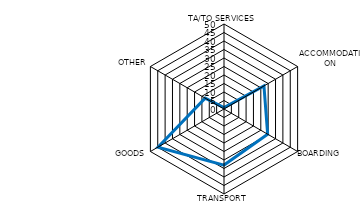
| Category | Series 0 |
|---|---|
| TA/TO SERVICES | 0.807 |
| ACCOMMODATION | 27.139 |
| BOARDING | 29.643 |
| TRANSPORT | 32.999 |
| GOODS | 44.839 |
| OTHER | 12.797 |